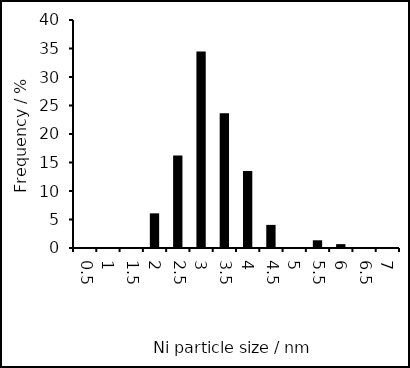
| Category | Series 0 |
|---|---|
| 0.5 | 0 |
| 1.0 | 0 |
| 1.5 | 0 |
| 2.0 | 6.081 |
| 2.5 | 16.216 |
| 3.0 | 34.459 |
| 3.5 | 23.649 |
| 4.0 | 13.514 |
| 4.5 | 4.054 |
| 5.0 | 0 |
| 5.5 | 1.351 |
| 6.0 | 0.676 |
| 6.5 | 0 |
| 7.0 | 0 |